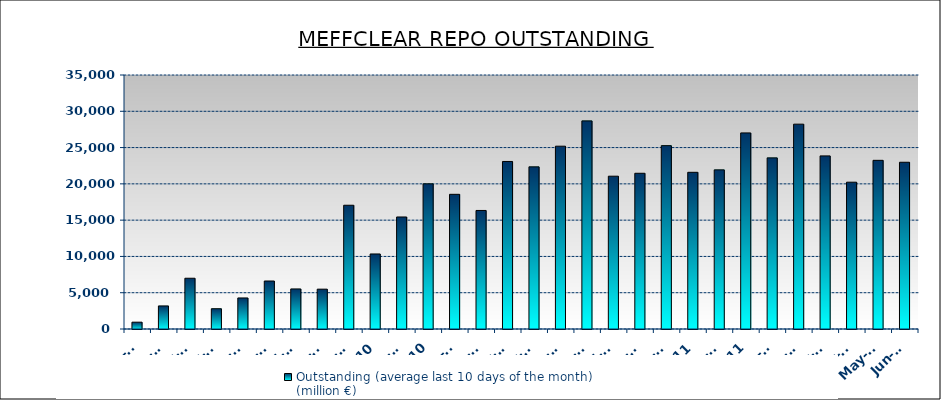
| Category | Outstanding (average last 10 days of the month)
(million €) |
|---|---|
| 2010-01-01 | 939.598 |
| 2010-02-01 | 3181.893 |
| 2010-03-01 | 6993.584 |
| 2010-04-01 | 2799.796 |
| 2010-05-01 | 4278.538 |
| 2010-06-01 | 6612.262 |
| 2010-07-01 | 5522.051 |
| 2010-08-01 | 5488.651 |
| 2010-09-01 | 17053.898 |
| 2010-10-01 | 10339.747 |
| 2010-11-01 | 15435.338 |
| 2010-12-02 | 20010 |
| 2011-01-03 | 18558 |
| 2011-02-04 | 16335 |
| 2011-03-05 | 23085.821 |
| 2011-04-01 | 22350 |
| 2011-05-02 | 25189 |
| 2011-06-03 | 28680.645 |
| 2011-07-03 | 21056.617 |
| 2011-08-01 | 21459 |
| 2011-09-02 | 25269 |
| 2011-10-01 | 21591.07 |
| 2011-11-02 | 21933.437 |
| 2011-12-03 | 27018.908 |
| 2012-01-01 | 23586.147 |
| 2012-02-01 | 28224.984 |
| 2012-03-01 | 23852 |
| 2012-04-01 | 20228.932 |
| 2012-05-02 | 23241.728 |
| 2012-06-01 | 22976.771 |